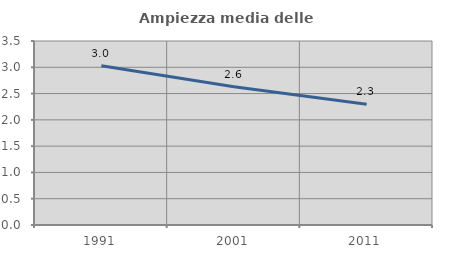
| Category | Ampiezza media delle famiglie |
|---|---|
| 1991.0 | 3.028 |
| 2001.0 | 2.63 |
| 2011.0 | 2.297 |